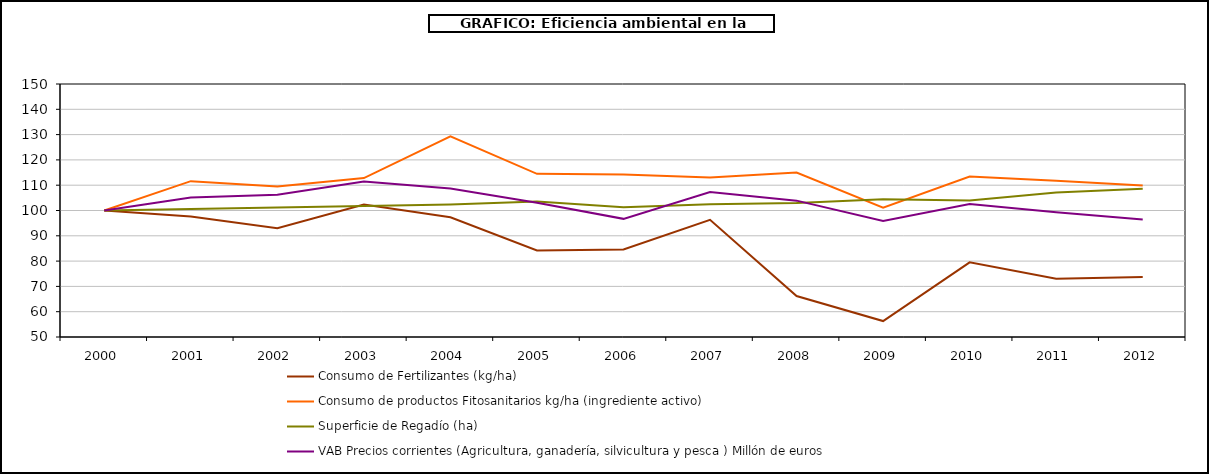
| Category | Consumo de Fertilizantes (kg/ha) | Consumo de productos Fitosanitarios kg/ha (ingrediente activo) | Superficie de Regadío (ha) | VAB Precios corrientes (Agricultura, ganadería, silvicultura y pesca ) Millón de euros |
|---|---|---|---|---|
| 2000.0 | 100 | 100 | 100 | 100 |
| 2001.0 | 97.6 | 111.6 | 100.6 | 105.1 |
| 2002.0 | 93 | 109.5 | 101.2 | 106.2 |
| 2003.0 | 102.4 | 112.8 | 101.8 | 111.5 |
| 2004.0 | 97.3 | 129.3 | 102.4 | 108.7 |
| 2005.0 | 84.2 | 114.5 | 103.6 | 103.1 |
| 2006.0 | 84.6 | 114.2 | 101.3 | 96.7 |
| 2007.0 | 96.3 | 113 | 102.5 | 107.3 |
| 2008.0 | 66.2 | 115 | 103 | 103.9 |
| 2009.0 | 56.3 | 101.1 | 104.4 | 95.9 |
| 2010.0 | 79.5 | 113.4 | 104 | 102.6 |
| 2011.0 | 73 | 111.8 | 107.1 | 99.3 |
| 2012.0 | 73.7 | 109.9 | 108.6 | 96.4 |